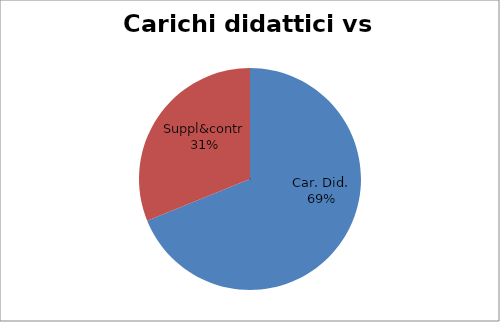
| Category | Series 0 |
|---|---|
| Car. Did. | 0.689 |
| Suppl&contr | 0.311 |